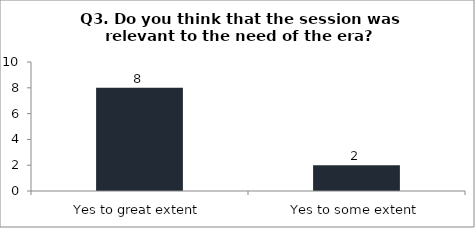
| Category | Q3. Do you think that the session was relevant to the need of the era? |
|---|---|
| Yes to great extent | 8 |
| Yes to some extent | 2 |